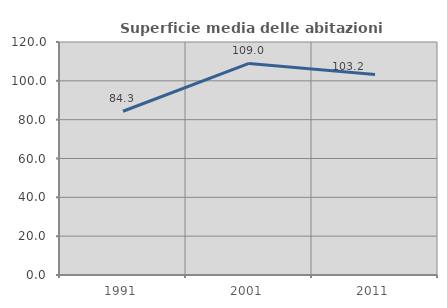
| Category | Superficie media delle abitazioni occupate |
|---|---|
| 1991.0 | 84.323 |
| 2001.0 | 108.981 |
| 2011.0 | 103.226 |